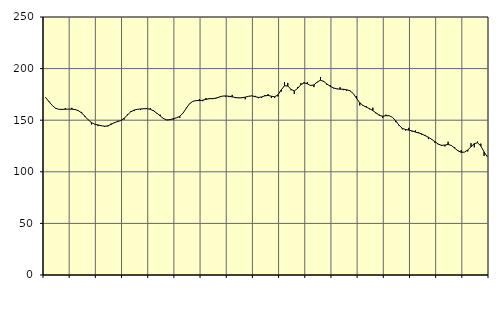
| Category | Piggar | Series 1 |
|---|---|---|
| nan | 171.5 | 171.88 |
| 87.0 | 168.6 | 168.1 |
| 87.0 | 164.5 | 164.39 |
| 87.0 | 161.3 | 161.65 |
| nan | 160.5 | 160.55 |
| 88.0 | 160.1 | 160.46 |
| 88.0 | 161.6 | 160.67 |
| 88.0 | 160.6 | 160.74 |
| nan | 162 | 160.68 |
| 89.0 | 160.4 | 160.33 |
| 89.0 | 159.6 | 159.26 |
| 89.0 | 158 | 157.08 |
| nan | 153.1 | 153.81 |
| 90.0 | 150.5 | 150.34 |
| 90.0 | 145.9 | 147.67 |
| 90.0 | 146 | 146.16 |
| nan | 144.3 | 145.35 |
| 91.0 | 144.8 | 144.66 |
| 91.0 | 143.5 | 144.16 |
| 91.0 | 144 | 144.53 |
| nan | 146.8 | 145.94 |
| 92.0 | 148.1 | 147.61 |
| 92.0 | 149.4 | 148.7 |
| 92.0 | 149.6 | 149.72 |
| nan | 150.6 | 151.87 |
| 93.0 | 155.8 | 155.08 |
| 93.0 | 158.6 | 158.05 |
| 93.0 | 158.8 | 159.78 |
| nan | 160.7 | 160.51 |
| 94.0 | 159.9 | 160.89 |
| 94.0 | 161.5 | 161.13 |
| 94.0 | 161.1 | 161.16 |
| nan | 161.7 | 160.56 |
| 95.0 | 159.6 | 159.05 |
| 95.0 | 156.5 | 156.81 |
| 95.0 | 155.4 | 154.09 |
| nan | 152 | 151.64 |
| 96.0 | 150 | 150.29 |
| 96.0 | 150.7 | 150.46 |
| 96.0 | 150.3 | 151.48 |
| nan | 152.4 | 152.31 |
| 97.0 | 152.3 | 153.77 |
| 97.0 | 156.9 | 156.96 |
| 97.0 | 162.1 | 161.67 |
| nan | 166.3 | 166.01 |
| 98.0 | 168.3 | 168.29 |
| 98.0 | 169.1 | 168.99 |
| 98.0 | 170.5 | 169.02 |
| nan | 168.4 | 169.37 |
| 99.0 | 171.5 | 170.17 |
| 99.0 | 171.5 | 170.81 |
| 99.0 | 170.4 | 170.99 |
| nan | 170.7 | 171.36 |
| 0.0 | 172.2 | 172.42 |
| 0.0 | 173.2 | 173.3 |
| 0.0 | 172.7 | 173.54 |
| nan | 172.4 | 173.23 |
| 1.0 | 174.5 | 172.61 |
| 1.0 | 171.4 | 171.97 |
| 1.0 | 172 | 171.58 |
| nan | 172.4 | 171.75 |
| 2.0 | 170.3 | 172.33 |
| 2.0 | 173.3 | 173.16 |
| 2.0 | 173.8 | 173.58 |
| nan | 173.6 | 172.87 |
| 3.0 | 171.3 | 172.08 |
| 3.0 | 171.5 | 172.49 |
| 3.0 | 174.4 | 173.6 |
| nan | 175.4 | 173.99 |
| 4.0 | 171.5 | 173.24 |
| 4.0 | 171.5 | 172.68 |
| 4.0 | 173 | 174.56 |
| nan | 177.7 | 179.34 |
| 5.0 | 186.9 | 183.4 |
| 5.0 | 186.1 | 183.15 |
| 5.0 | 179 | 179.86 |
| nan | 175.4 | 178.43 |
| 6.0 | 182.2 | 180.74 |
| 6.0 | 185.9 | 184.44 |
| 6.0 | 187 | 186.17 |
| nan | 187 | 185.26 |
| 7.0 | 183.1 | 183.64 |
| 7.0 | 182.1 | 184.18 |
| 7.0 | 186.6 | 186.99 |
| nan | 191.7 | 188.71 |
| 8.0 | 187 | 187.55 |
| 8.0 | 184.1 | 185 |
| 8.0 | 184 | 182.8 |
| nan | 180.9 | 181.28 |
| 9.0 | 180.7 | 180.33 |
| 9.0 | 181.9 | 180.07 |
| 9.0 | 179.1 | 179.98 |
| nan | 178.5 | 179.49 |
| 10.0 | 178.9 | 178.55 |
| 10.0 | 175.8 | 175.88 |
| 10.0 | 173.4 | 171.21 |
| nan | 164.3 | 166.94 |
| 11.0 | 164.5 | 164.23 |
| 11.0 | 163.6 | 162.66 |
| 11.0 | 160.6 | 161.18 |
| nan | 162.1 | 159.29 |
| 12.0 | 156.5 | 156.99 |
| 12.0 | 155.3 | 154.67 |
| 12.0 | 152.2 | 153.82 |
| nan | 155.4 | 154.35 |
| 13.0 | 154.2 | 154.39 |
| 13.0 | 152.8 | 152.73 |
| 13.0 | 148.1 | 149.35 |
| nan | 144.6 | 145.18 |
| 14.0 | 141.1 | 142.14 |
| 14.0 | 140 | 140.94 |
| 14.0 | 142.6 | 140.43 |
| nan | 139 | 139.64 |
| 15.0 | 140.1 | 138.52 |
| 15.0 | 138.4 | 137.67 |
| 15.0 | 135.7 | 136.58 |
| nan | 135.7 | 135.05 |
| 16.0 | 131.7 | 133.43 |
| 16.0 | 131 | 131.43 |
| 16.0 | 128 | 129.17 |
| nan | 126.4 | 126.9 |
| 17.0 | 125 | 125.65 |
| 17.0 | 124.6 | 125.88 |
| 17.0 | 129.1 | 126.5 |
| nan | 125.2 | 125.52 |
| 18.0 | 123.8 | 122.93 |
| 18.0 | 120.8 | 120.39 |
| 18.0 | 121 | 118.88 |
| nan | 119.1 | 119.08 |
| 19.0 | 119.7 | 121.14 |
| 19.0 | 127.7 | 124.25 |
| 19.0 | 123.7 | 127.33 |
| nan | 129.3 | 128.11 |
| 20.0 | 127.3 | 125.03 |
| 20.0 | 115.4 | 119.28 |
| 20.0 | 114.5 | 114.44 |